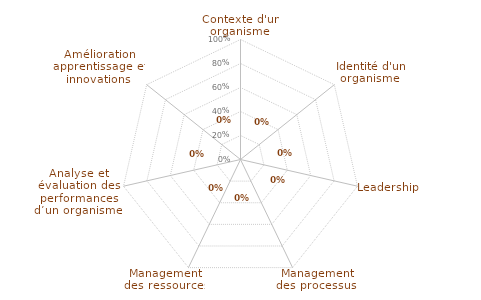
| Category | Graphe radar |
|---|---|
| Contexte d'un organisme  | 0 |
| Identité d'un organisme  | 0 |
| Leadership  | 0 |
| Management des processus  | 0 |
| Management des ressources | 0 |
| Analyse et évaluation des performances d’un organisme  | 0 |
| Amélioration apprentissage et innovations  | 0 |